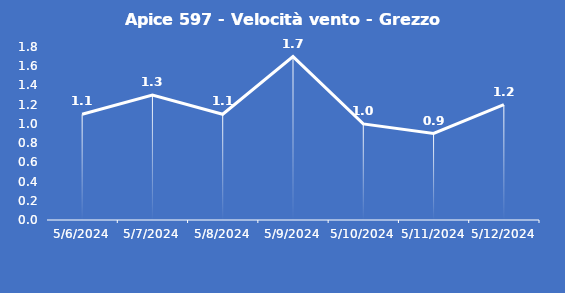
| Category | Apice 597 - Velocità vento - Grezzo (m/s) |
|---|---|
| 5/6/24 | 1.1 |
| 5/7/24 | 1.3 |
| 5/8/24 | 1.1 |
| 5/9/24 | 1.7 |
| 5/10/24 | 1 |
| 5/11/24 | 0.9 |
| 5/12/24 | 1.2 |